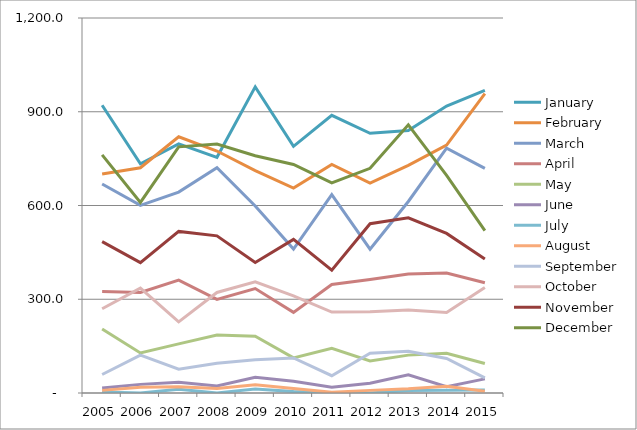
| Category | January | February | March | April | May | June | July | August | September | October | November | December |
|---|---|---|---|---|---|---|---|---|---|---|---|---|
| 2005.0 | 920.7 | 700.6 | 668.8 | 324.8 | 205 | 16.1 | 2.9 | 8.4 | 59.2 | 269.7 | 484.2 | 762 |
| 2006.0 | 733.5 | 720.9 | 600.4 | 321.6 | 128.2 | 27.6 | 0.3 | 18.2 | 121 | 335.7 | 417.3 | 610 |
| 2007.0 | 797.1 | 820 | 643 | 361.1 | 157.3 | 34.2 | 11.8 | 20.1 | 76 | 227.5 | 517 | 787.7 |
| 2008.0 | 754.2 | 774.3 | 721.1 | 299.6 | 185.4 | 22.4 | 0.3 | 14.4 | 95.4 | 321.8 | 502.8 | 796.7 |
| 2009.0 | 979.5 | 711.5 | 598.3 | 334.3 | 181.6 | 50.4 | 13.1 | 26.1 | 106.5 | 355.5 | 417.4 | 759.4 |
| 2010.0 | 789.2 | 655.8 | 460.7 | 258.1 | 112.3 | 37.6 | 4.5 | 14.7 | 112 | 311 | 491.6 | 731.4 |
| 2011.0 | 888.7 | 731.6 | 634.6 | 347.4 | 142.8 | 18.5 | 0 | 2.3 | 55.4 | 259.1 | 392.9 | 672.2 |
| 2012.0 | 831 | 671.4 | 460.3 | 363.3 | 102.4 | 31.4 | 0 | 8.4 | 127.3 | 259.86 | 541.7 | 719.1 |
| 2013.0 | 839.9 | 728.5 | 612.9 | 381.1 | 121.2 | 58.1 | 7.7 | 13.4 | 133.2 | 265.2 | 560.8 | 858.2 |
| 2014.0 | 918.3 | 793.2 | 783.6 | 384.2 | 127.3 | 20.3 | 8.8 | 21.4 | 110.3 | 257.9 | 510.6 | 696.4 |
| 2015.0 | 968.2 | 957.8 | 718.6 | 352.6 | 94.2 | 45.2 | 9.3 | 5.6 | 48.4 | 337.3 | 429 | 519.9 |